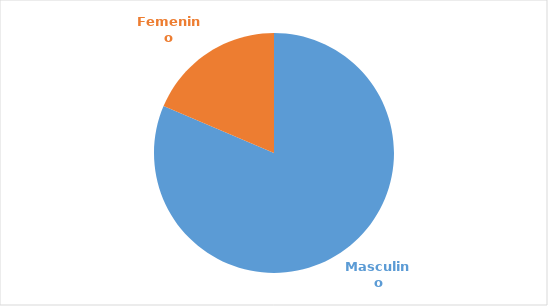
| Category | Series 0 |
|---|---|
| Masculino | 0.814 |
| Femenino | 0.186 |